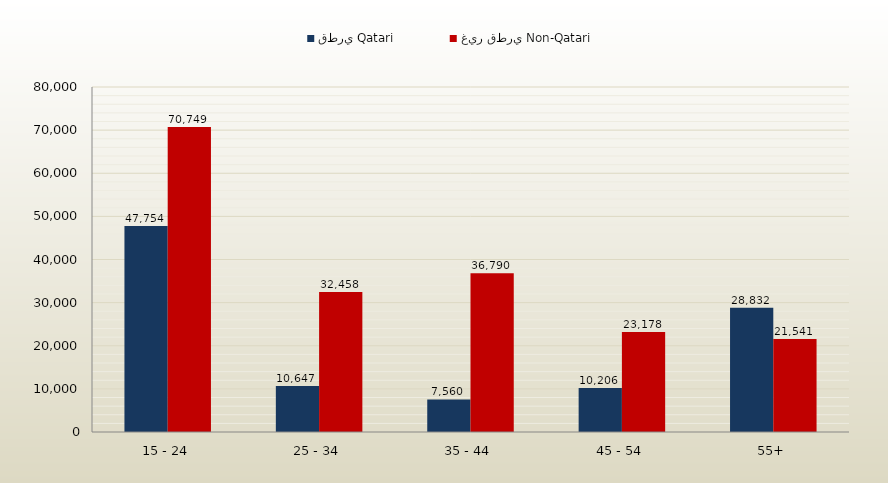
| Category | قطري Qatari | غير قطري Non-Qatari |
|---|---|---|
| 15 - 24 | 47754 | 70749 |
| 25 - 34 | 10647 | 32458 |
| 35 - 44 | 7560 | 36790 |
| 45 - 54 | 10206 | 23178 |
| 55+ | 28832 | 21541 |